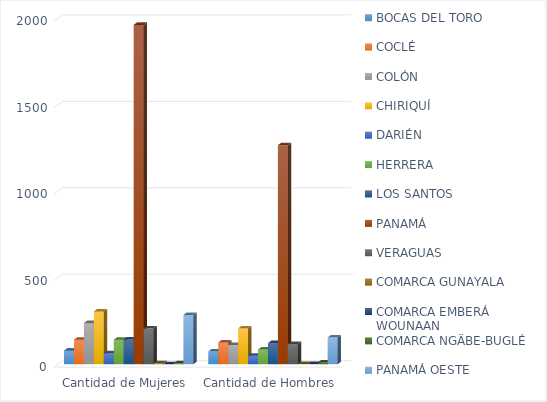
| Category | BOCAS DEL TORO | COCLÉ | COLÓN | CHIRIQUÍ | DARIÉN | HERRERA | LOS SANTOS | PANAMÁ | VERAGUAS | COMARCA GUNAYALA | COMARCA EMBERÁ WOUNAAN | COMARCA NGÄBE-BUGLÉ | PANAMÁ OESTE |
|---|---|---|---|---|---|---|---|---|---|---|---|---|---|
| Cantidad de Mujeres | 79 | 142 | 238 | 305 | 63 | 142 | 143 | 1963 | 207 | 5 | 0 | 5 | 285 |
| Cantidad de Hombres | 74 | 126 | 111 | 207 | 49 | 85 | 122 | 1267 | 117 | 1 | 1 | 10 | 155 |